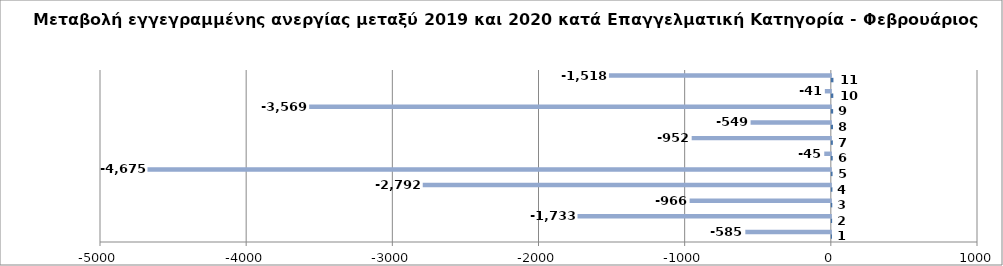
| Category | Series 0 | Series 1 |
|---|---|---|
| 0 | 1 | -585 |
| 1 | 2 | -1733 |
| 2 | 3 | -966 |
| 3 | 4 | -2792 |
| 4 | 5 | -4675 |
| 5 | 6 | -45 |
| 6 | 7 | -952 |
| 7 | 8 | -549 |
| 8 | 9 | -3569 |
| 9 | 10 | -41 |
| 10 | 11 | -1518 |